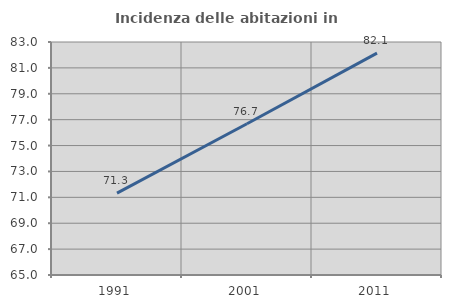
| Category | Incidenza delle abitazioni in proprietà  |
|---|---|
| 1991.0 | 71.32 |
| 2001.0 | 76.682 |
| 2011.0 | 82.14 |